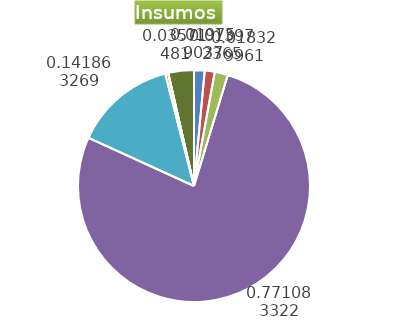
| Category | Series 0 |
|---|---|
| Control arvenses | 872616 |
| Control fitosanitario | 826104.7 |
| Cosecha y beneficio | 1083744 |
| Fertilización | 45589672 |
| Instalación | 8387550 |
| Otros | 252888 |
| Podas | 0 |
| Riego | 0 |
| Transporte | 2111609 |
| Tutorado | 0 |